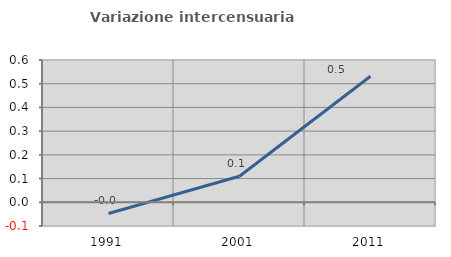
| Category | Variazione intercensuaria annua |
|---|---|
| 1991.0 | -0.047 |
| 2001.0 | 0.11 |
| 2011.0 | 0.531 |